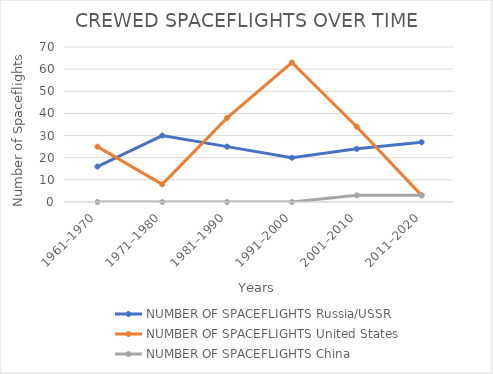
| Category | NUMBER OF SPACEFLIGHTS |
|---|---|
| 1961–1970 | 0 |
| 1971–1980 | 0 |
| 1981–1990 | 0 |
| 1991–2000 | 0 |
| 2001–2010 | 3 |
| 2011–2020 | 3 |